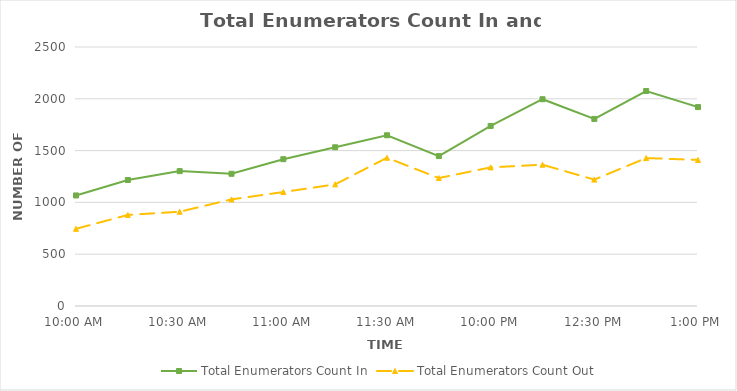
| Category | Total Enumerators Count In | Total Enumerators Count Out |
|---|---|---|
| 0.4166666666666667 | 1067 | 745 |
| 0.4270833333333333 | 1216 | 879 |
| 0.4375 | 1302 | 910 |
| 0.4479166666666667 | 1276 | 1029 |
| 0.4583333333333333 | 1417 | 1100 |
| 0.46875 | 1532 | 1174 |
| 0.4791666666666667 | 1648 | 1431 |
| 0.4895833333333333 | 1447 | 1235 |
| 0.5 | 1738 | 1338 |
| 0.5104166666666666 | 1996 | 1364 |
| 0.5208333333333334 | 1806 | 1220 |
| 0.53125 | 2075 | 1428 |
| 0.5416666666666666 | 1920 | 1410 |